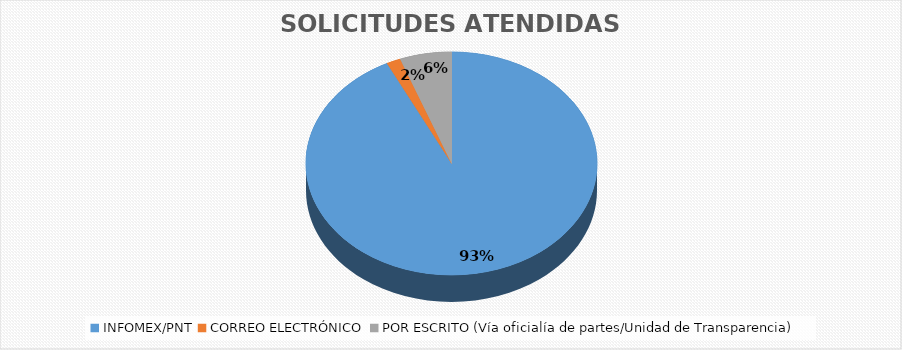
| Category | Series 0 |
|---|---|
| INFOMEX/PNT | 11716 |
| CORREO ELECTRÓNICO | 199 |
| POR ESCRITO (Vía oficialía de partes/Unidad de Transparencia) | 726 |